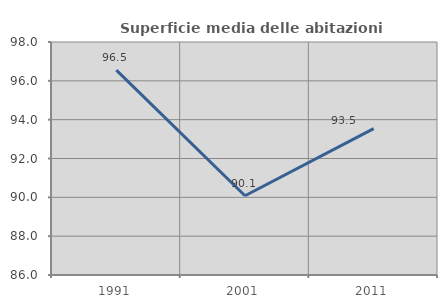
| Category | Superficie media delle abitazioni occupate |
|---|---|
| 1991.0 | 96.549 |
| 2001.0 | 90.08 |
| 2011.0 | 93.538 |